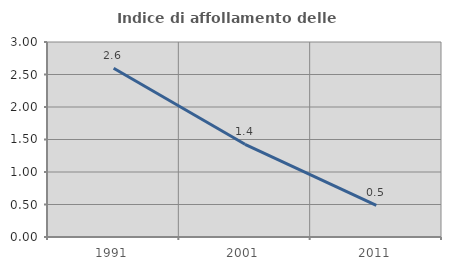
| Category | Indice di affollamento delle abitazioni  |
|---|---|
| 1991.0 | 2.595 |
| 2001.0 | 1.426 |
| 2011.0 | 0.486 |